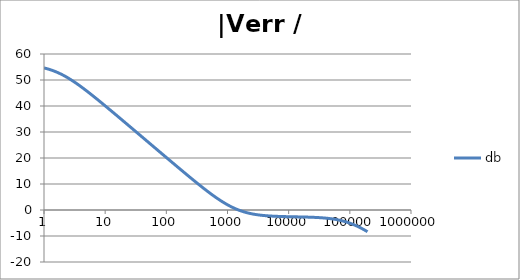
| Category | db |
|---|---|
| 1.0 | 54.636 |
| 1.0634378492473788 | 54.48 |
| 1.1309000592118907 | 54.31 |
| 1.2026419266820265 | 54.126 |
| 1.278934943925458 | 53.926 |
| 1.3600678260954062 | 53.711 |
| 1.4463476038134566 | 53.48 |
| 1.5381007850634825 | 53.232 |
| 1.6356745907936145 | 52.968 |
| 1.739438268902148 | 52.688 |
| 1.849784491579884 | 52.392 |
| 1.967130841296868 | 52.079 |
| 2.091921391056928 | 51.75 |
| 2.2246283849001642 | 51.407 |
| 2.365754025012901 | 51.048 |
| 2.5158323722080485 | 50.675 |
| 2.6754313669678584 | 50.289 |
| 2.8451549786972743 | 49.89 |
| 3.025645491321301 | 49.479 |
| 3.2175859338757533 | 49.057 |
| 3.42170266528945 | 48.624 |
| 3.6387681231394358 | 48.181 |
| 3.8696037467813236 | 47.73 |
| 4.115083085916729 | 47.27 |
| 4.376135106361553 | 46.803 |
| 4.653747705525078 | 46.329 |
| 4.948971450903514 | 45.848 |
| 5.262923555735513 | 45.362 |
| 5.596792106864742 | 44.871 |
| 5.951840560808945 | 44.375 |
| 6.329412525049976 | 43.875 |
| 6.730936842638569 | 43.371 |
| 7.157932999355504 | 42.864 |
| 7.612016873891456 | 42.354 |
| 8.094906852805886 | 41.841 |
| 8.608430333405762 | 41.326 |
| 9.154530639152917 | 40.809 |
| 9.735274373770007 | 40.29 |
| 10.352859241875105 | 39.769 |
| 11.009622365740512 | 39.247 |
| 11.708049129648925 | 38.723 |
| 12.4507825853165 | 38.198 |
| 13.240633453975693 | 37.672 |
| 14.080590762968805 | 37.145 |
| 14.973833157104059 | 36.617 |
| 15.923740927579823 | 36.089 |
| 16.93390880399795 | 35.56 |
| 18.008159557874837 | 35.03 |
| 19.150558469130036 | 34.5 |
| 20.365428710297824 | 33.969 |
| 21.65736770667993 | 33.438 |
| 23.031264534351347 | 32.907 |
| 24.492318421858034 | 32.375 |
| 26.046058425622668 | 31.843 |
| 27.698364353515743 | 31.311 |
| 29.45548901577305 | 30.779 |
| 31.32408188746347 | 30.246 |
| 33.311214272052936 | 29.714 |
| 35.42440606129053 | 29.181 |
| 37.67165419268462 | 28.648 |
| 40.06146291225952 | 28.115 |
| 42.60287595711691 | 27.582 |
| 45.30551077958928 | 27.049 |
| 48.17959494250036 | 26.516 |
| 51.23600482326248 | 25.983 |
| 54.486306773278585 | 25.45 |
| 57.94280088840825 | 24.918 |
| 61.61856755613799 | 24.385 |
| 65.52751695560372 | 23.852 |
| 69.68444169778837 | 23.319 |
| 74.10507280510043 | 22.787 |
| 78.80613924217637 | 22.254 |
| 83.8054312231895 | 21.722 |
| 89.12186753523771 | 21.19 |
| 94.77556713258299 | 20.658 |
| 100.78792527267464 | 20.127 |
| 107.18169448207877 | 19.596 |
| 113.98107065871142 | 19.065 |
| 121.21178463621371 | 18.535 |
| 128.90119955697148 | 18.005 |
| 137.07841442227294 | 17.476 |
| 145.77437421146283 | 16.947 |
| 155.02198698682062 | 16.419 |
| 164.85624842731968 | 15.892 |
| 175.3143742625403 | 15.366 |
| 186.43594110790573 | 14.841 |
| 198.26303623420247 | 14.317 |
| 210.84041683815525 | 13.794 |
| 224.21567941678887 | 13.273 |
| 238.43943988652958 | 12.753 |
| 253.56552512868072 | 12.235 |
| 269.65117668612646 | 11.72 |
| 286.75726738211927 | 11.206 |
| 304.9485316808965 | 10.696 |
| 324.2938106618788 | 10.188 |
| 344.8663125345048 | 9.683 |
| 366.7438896795682 | 9.182 |
| 390.00933326545766 | 8.685 |
| 414.7506865542229 | 8.193 |
| 441.06157808309626 | 7.706 |
| 469.0415759823428 | 7.224 |
| 498.7965647702637 | 6.748 |
| 530.4391460512702 | 6.279 |
| 564.089064633379 | 5.817 |
| 599.8736616776864 | 5.364 |
| 637.9283565946681 | 4.919 |
| 678.3971595109495 | 4.484 |
| 721.4332162458546 | 4.059 |
| 767.1993878601115 | 3.645 |
| 815.868866969862 | 3.243 |
| 867.6258331583267 | 2.854 |
| 922.6661499653554 | 2.478 |
| 981.1981060925172 | 2.115 |
| 1043.443203628628 | 1.768 |
| 1109.6369962786232 | 1.436 |
| 1180.0299807678607 | 1.119 |
| 1254.8885447951977 | 0.819 |
| 1334.4959751221782 | 0.535 |
| 1419.1535296132129 | 0.267 |
| 1509.1815772837017 | 0.015 |
| 1604.9208106703452 | -0.22 |
| 1706.7335351116335 | -0.439 |
| 1815.0050398174897 | -0.643 |
| 1930.1450559166665 | -0.831 |
| 2052.58930699948 | -1.004 |
| 2182.801158023697 | -1.164 |
| 2321.2733688234066 | -1.31 |
| 2468.5299588567814 | -1.443 |
| 2625.128190249376 | -1.565 |
| 2791.6606766374607 | -1.675 |
| 2968.757625791824 | -1.776 |
| 3157.08922450881 | -1.866 |
| 3357.3681747937244 | -1.948 |
| 3570.352390934236 | -2.022 |
| 3796.8478676703417 | -2.088 |
| 4037.7117303148448 | -2.148 |
| 4293.8554783669315 | -2.201 |
| 4566.248434893605 | -2.249 |
| 4855.9214147324665 | -2.293 |
| 5163.970625397384 | -2.331 |
| 5491.561815449236 | -2.366 |
| 5839.934686030357 | -2.397 |
| 6210.40758225729 | -2.425 |
| 6604.382482225307 | -2.451 |
| 7023.350302504747 | -2.474 |
| 7468.896540206577 | -2.495 |
| 7942.707272968458 | -2.514 |
| 8446.575539567106 | -2.531 |
| 8982.408125302747 | -2.547 |
| 9552.232777834151 | -2.562 |
| 10158.205880770249 | -2.577 |
| 10802.620614058389 | -2.59 |
| 11487.915632049675 | -2.603 |
| 12216.684292082227 | -2.616 |
| 12991.684468506162 | -2.629 |
| 13815.848989288772 | -2.642 |
| 14692.296734695852 | -2.655 |
| 15624.344440049217 | -2.669 |
| 16615.519247226184 | -2.683 |
| 17669.572052398642 | -2.698 |
| 18790.49170052441 | -2.715 |
| 19982.5200803064 | -2.732 |
| 21250.168176743602 | -2.751 |
| 22598.233142021272 | -2.772 |
| 24031.816449341983 | -2.796 |
| 25556.34319839602 | -2.821 |
| 27177.582645530147 | -2.85 |
| 28901.67003630542 | -2.881 |
| 30735.129823066054 | -2.917 |
| 32684.900355380338 | -2.956 |
| 34758.3601367905 | -2.999 |
| 36963.35574723439 | -3.048 |
| 39308.23153680468 | -3.102 |
| 41801.861203217486 | -3.162 |
| 44453.68137248706 | -3.229 |
| 47273.727309885995 | -3.303 |
| 50272.670896332245 | -3.385 |
| 53461.86101391677 | -3.476 |
| 56853.36649340195 | -3.577 |
| 60460.02178621637 | -3.688 |
| 64295.47553378361 | -3.809 |
| 68374.24221798431 | -3.943 |
| 72711.75708821259 | -4.088 |
| 77324.43457288652 | -4.247 |
| 82229.73039646025 | -4.419 |
| 87446.2076370035 | -4.606 |
| 92993.60697433475 | -4.807 |
| 98892.92139454243 | -5.023 |
| 105166.47563360249 | -5.254 |
| 111838.01066072512 | -5.5 |
| 118932.77352114675 | -5.762 |
| 126477.61287835392 | -6.038 |
| 134501.0806172993 | -6.329 |
| 143033.53989310883 | -6.634 |
| 152107.28003416685 | -6.953 |
| 161756.63873440344 | -7.284 |
| 172018.1319971993 | -7.627 |
| 182930.592322653 | -7.981 |
| 194535.31566115122 | -8.345 |